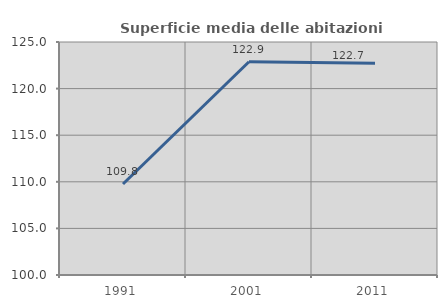
| Category | Superficie media delle abitazioni occupate |
|---|---|
| 1991.0 | 109.767 |
| 2001.0 | 122.883 |
| 2011.0 | 122.712 |